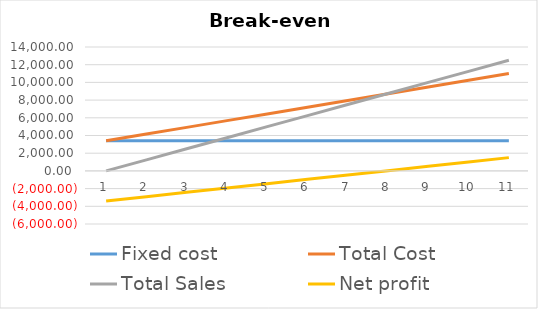
| Category | Fixed cost | Total Cost | Total Sales | Net profit |
|---|---|---|---|---|
| 0 | 3400 | 3400 | 0 | -3400 |
| 1 | 3400 | 4160 | 1250 | -2910 |
| 2 | 3400 | 4920 | 2500 | -2420 |
| 3 | 3400 | 5680 | 3750 | -1930 |
| 4 | 3400 | 6440 | 5000 | -1440 |
| 5 | 3400 | 7200 | 6250 | -950 |
| 6 | 3400 | 7960 | 7500 | -460 |
| 7 | 3400 | 8720 | 8750 | 30 |
| 8 | 3400 | 9480 | 10000 | 520 |
| 9 | 3400 | 10240 | 11250 | 1010 |
| 10 | 3400 | 11000 | 12500 | 1500 |